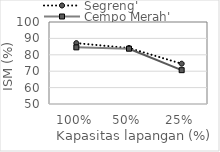
| Category | Segreng' | Cempo Merah' |
|---|---|---|
| 1.0 | 87.11 | 84.53 |
| 0.5 | 84.12 | 83.71 |
| 0.25 | 74.56 | 70.63 |